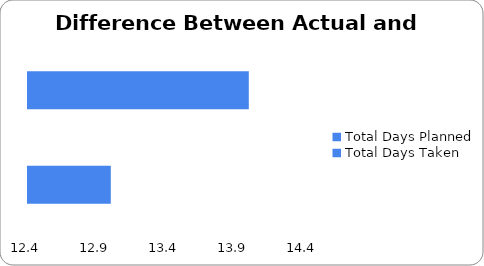
| Category | Series 0 |
|---|---|
| Total Days Planned | 13 |
| Total Days Taken | 14 |